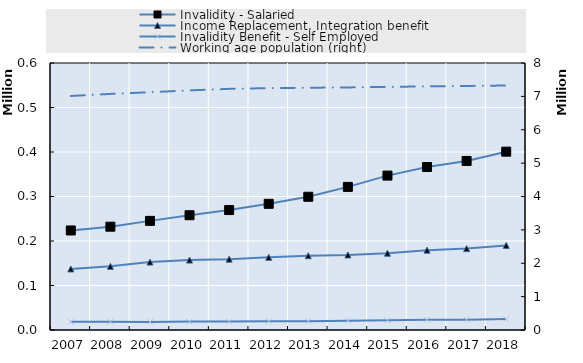
| Category | Invalidity - Salaried | Income Replacement, Integration benefit | Invalidity Benefit - Self Employed |
|---|---|---|---|
| 2007.0 | 223684 | 137242 | 18402 |
| 2008.0 | 232153 | 143037 | 18552 |
| 2009.0 | 245209 | 152694 | 18219 |
| 2010.0 | 257935 | 157170 | 18964 |
| 2011.0 | 269499 | 159246 | 19015 |
| 2012.0 | 283541 | 163336 | 19535 |
| 2013.0 | 299408 | 166903 | 19827 |
| 2014.0 | 321573 | 168625 | 20757 |
| 2015.0 | 346971 | 172576 | 21857 |
| 2016.0 | 366293 | 179452 | 22908 |
| 2017.0 | 379908 | 182895 | 23287 |
| 2018.0 | 400745 | 190141 | 24497 |